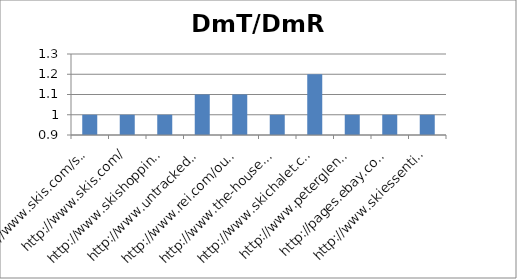
| Category | DmT/DmR |
|---|---|
| http://www.skis.com/ski-equipment/c9/ | 1 |
| http://www.skis.com/ | 1 |
| http://www.skishoppingguide.com/ | 1 |
| http://www.untracked.com/ | 1.1 |
| http://www.rei.com/outlet/category/22000078 | 1.1 |
| http://www.the-house.com/skis.html | 1 |
| http://www.skichalet.com/ | 1.2 |
| http://www.peterglenn.com/ | 1 |
| http://pages.ebay.com/buy/guides/skis-skiing-equipment-buying-guide/ | 1 |
| http://www.skiessentials.com/ | 1 |